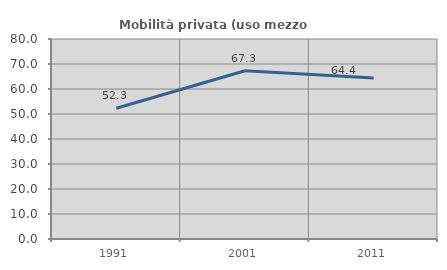
| Category | Mobilità privata (uso mezzo privato) |
|---|---|
| 1991.0 | 52.308 |
| 2001.0 | 67.287 |
| 2011.0 | 64.43 |